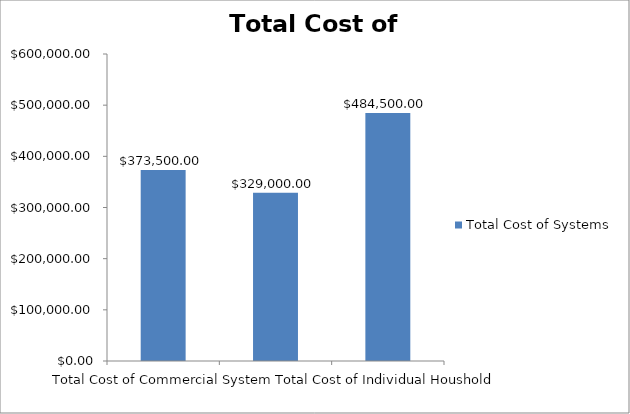
| Category | Total Cost of Systems |
|---|---|
| Total Cost of Commercial System | 373500 |
| Total Cost of 41 Unit Residential | 329000 |
| Total Cost of Individual Houshold | 484500 |